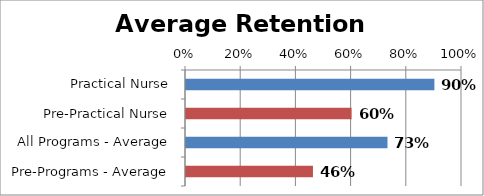
| Category | Series 0 |
|---|---|
| Practical Nurse | 0.9 |
| Pre-Practical Nurse | 0.6 |
| All Programs - Average | 0.73 |
| Pre-Programs - Average | 0.46 |